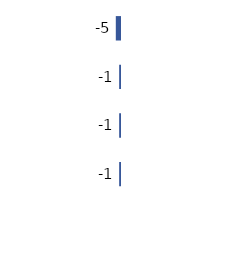
| Category | Series 0 |
|---|---|
| 0 | -5 |
| 1 | -1 |
| 2 | -1 |
| 3 | -1 |
| 4 | 0 |